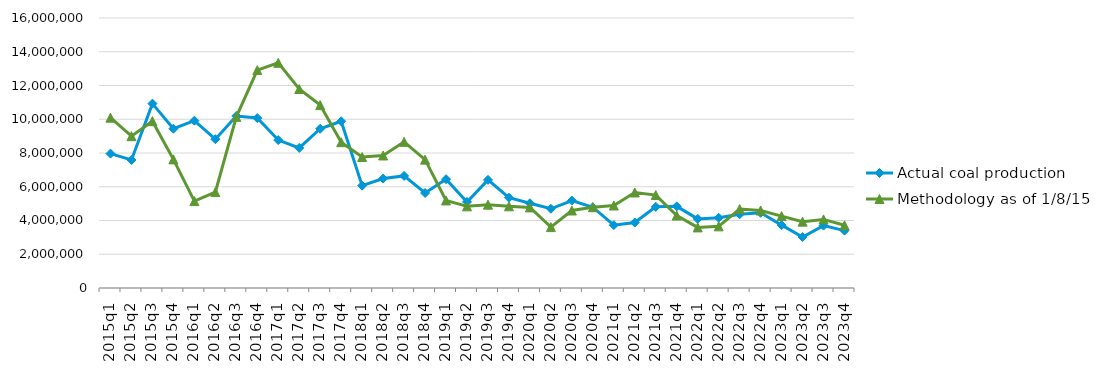
| Category | Actual coal production | Methodology as of 1/8/15 |
|---|---|---|
| 2015q1 | 7964547 | 10093744 |
| 2015q2 | 7586130 | 8995519 |
| 2015q3 | 10926372 | 9886893 |
| 2015q4 | 9440917 | 7621637 |
| 2016q1 | 9916532 | 5150282 |
| 2016q2 | 8818208 | 5683526 |
| 2016q3 | 10194348 | 10141184 |
| 2016q4 | 10071496 | 12913242 |
| 2017q1 | 8765310 | 13344477 |
| 2017q2 | 8299159 | 11791481 |
| 2017q3 | 9438715 | 10837658 |
| 2017q4 | 9879060 | 8639837 |
| 2018q1 | 6064242 | 7760271 |
| 2018q2 | 6485830 | 7853390 |
| 2018q3 | 6642365 | 8660324 |
| 2018q4 | 5630085 | 7607198 |
| 2019q1 | 6446669 | 5189257 |
| 2019q2 | 5100112 | 4838495 |
| 2019q3 | 6409066 | 4940409 |
| 2019q4 | 5350843 | 4841261 |
| 2020q1 | 5022211 | 4777066 |
| 2020q2 | 4693972 | 3608358 |
| 2020q3 | 5179321 | 4591701 |
| 2020q4 | 4786778 | 4786778 |
| 2021q1 | 3725860 | 4888322 |
| 2021q2 | 3877972 | 5661766 |
| 2021q3 | 4808221 | 5507803 |
| 2021q4 | 4838347 | 4292249 |
| 2022q1 | 4096075 | 3590388 |
| 2022q2 | 4162728 | 3652505 |
| 2022q3 | 4369474 | 4675712 |
| 2022q4 | 4455257 | 4592613 |
| 2023q1 | 3725573 | 4262136 |
| 2023q2 | 3020434 | 3931515 |
| 2023q3 | 3698855 | 4064767 |
| 2023q4 | 3399834 | 3717691 |